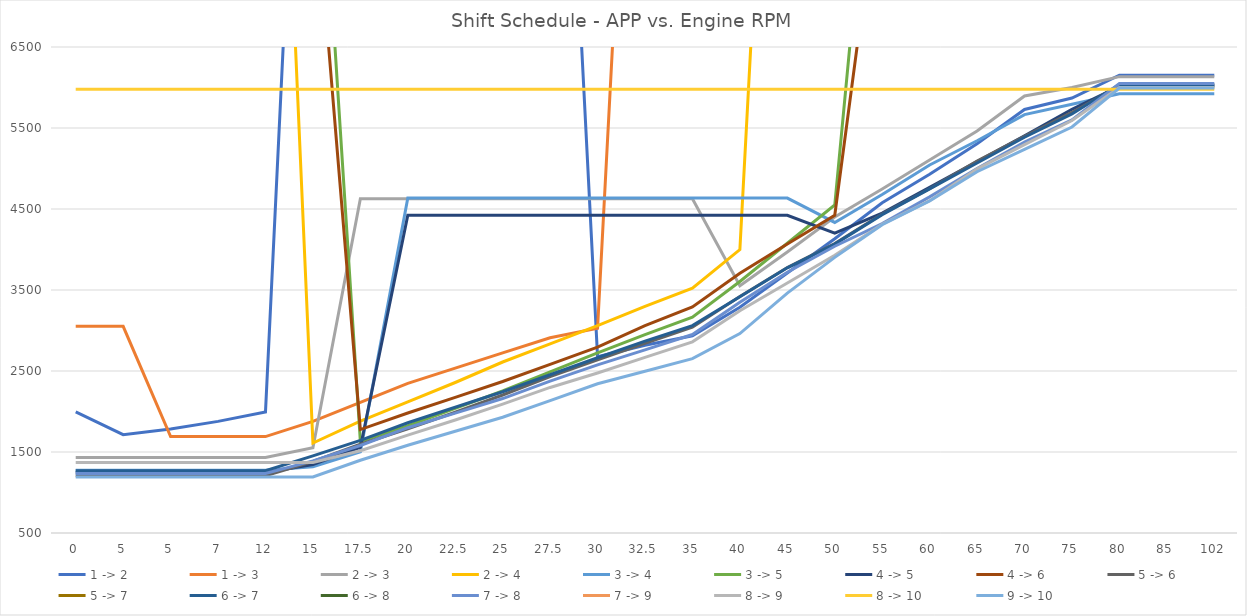
| Category | 1 -> 2 | 1 -> 3 | 2 -> 3 | 2 -> 4 | 3 -> 4 | 3 -> 5 | 4 -> 5 | 4 -> 6 | 5 -> 6 | 5 -> 7 | 6 -> 7 | 6 -> 8 | 7 -> 8 | 7 -> 9 | 8 -> 9 | 8 -> 10 | 9 -> 10 |
|---|---|---|---|---|---|---|---|---|---|---|---|---|---|---|---|---|---|
| 0.0 | 1995 | 3052 | 1432 | 14925 | 1276 | 10730 | 1247 | 8845 | 1208 | 10640 | 1268 | 8925 | 1235 | 7000 | 1370 | 5978 | 1191 |
| 5.0 | 1714 | 3052 | 1432 | 14925 | 1276 | 10730 | 1247 | 8845 | 1208 | 10640 | 1268 | 8925 | 1235 | 7000 | 1370 | 5978 | 1191 |
| 5.0 | 1784 | 1690 | 1432 | 14925 | 1276 | 10730 | 1247 | 8845 | 1208 | 10640 | 1268 | 8925 | 1235 | 7000 | 1370 | 5978 | 1191 |
| 7.0 | 1878 | 1690 | 1432 | 14925 | 1276 | 10730 | 1247 | 8845 | 1208 | 10640 | 1268 | 8925 | 1235 | 7000 | 1370 | 5978 | 1191 |
| 12.0 | 1995 | 1690 | 1432 | 14925 | 1276 | 10730 | 1247 | 8845 | 1208 | 10640 | 1268 | 8925 | 1235 | 7000 | 1370 | 5978 | 1191 |
| 15.0 | 14088 | 1878 | 1552 | 1611 | 1319 | 10730 | 1344 | 8845 | 1383 | 10640 | 1453 | 8925 | 1390 | 7000 | 1370 | 5978 | 1191 |
| 17.5 | 14088 | 2113 | 4626 | 1880 | 1502 | 1630 | 1556 | 1777 | 1596 | 10640 | 1644 | 8925 | 1580 | 7000 | 1515 | 5978 | 1398 |
| 20.0 | 14088 | 2348 | 4626 | 2119 | 4635 | 1824 | 4422 | 1981 | 1786 | 10640 | 1861 | 8925 | 1800 | 7000 | 1708 | 5978 | 1584 |
| 22.5 | 14088 | 2535 | 4626 | 2358 | 4635 | 2038 | 4422 | 2175 | 1991 | 10640 | 2052 | 8925 | 1980 | 7000 | 1895 | 5978 | 1756 |
| 25.0 | 14088 | 2723 | 4626 | 2611 | 4635 | 2253 | 4422 | 2370 | 2204 | 10640 | 2244 | 8925 | 2160 | 7000 | 2092 | 5978 | 1929 |
| 27.5 | 14088 | 2911 | 4626 | 2835 | 4635 | 2489 | 4422 | 2582 | 2432 | 10640 | 2454 | 8925 | 2375 | 7000 | 2297 | 5978 | 2135 |
| 30.0 | 2676 | 3028 | 4626 | 3059 | 4635 | 2725 | 4422 | 2795 | 2637 | 10640 | 2664 | 8925 | 2575 | 7000 | 2476 | 5978 | 2342 |
| 32.5 | 2817 | 14088 | 4626 | 3298 | 4635 | 2950 | 4422 | 3060 | 2842 | 10640 | 2868 | 8925 | 2760 | 7000 | 2668 | 5978 | 2497 |
| 35.0 | 2935 | 14088 | 4626 | 3522 | 4635 | 3165 | 4422 | 3290 | 3040 | 10640 | 3060 | 8925 | 2950 | 7000 | 2860 | 5978 | 2652 |
| 40.0 | 3287 | 14088 | 3552 | 3999 | 4635 | 3605 | 4422 | 3706 | 3420 | 10640 | 3417 | 8925 | 3350 | 7000 | 3245 | 5978 | 2962 |
| 45.0 | 3709 | 14088 | 3970 | 14925 | 4635 | 4077 | 4422 | 4068 | 3777 | 10640 | 3774 | 8925 | 3720 | 7000 | 3586 | 5978 | 3462 |
| 50.0 | 4132 | 14088 | 4402 | 14925 | 4334 | 4549 | 4201 | 4422 | 4073 | 10640 | 4067 | 8925 | 4040 | 7000 | 3928 | 5978 | 3903 |
| 55.0 | 4578 | 14088 | 4746 | 14925 | 4678 | 10730 | 4449 | 8845 | 4438 | 10640 | 4430 | 8925 | 4320 | 7000 | 4312 | 5978 | 4306 |
| 60.0 | 4930 | 14088 | 5104 | 14925 | 5043 | 10730 | 4767 | 8845 | 4750 | 10640 | 4749 | 8925 | 4650 | 7000 | 4603 | 5978 | 4599 |
| 65.0 | 5306 | 14088 | 5462 | 14925 | 5343 | 10730 | 5085 | 8845 | 5092 | 10640 | 5068 | 8925 | 5000 | 7000 | 4995 | 5978 | 4960 |
| 70.0 | 5729 | 14088 | 5895 | 14925 | 5665 | 10730 | 5404 | 8845 | 5396 | 10640 | 5386 | 8925 | 5325 | 7000 | 5294 | 5978 | 5236 |
| 75.0 | 5870 | 14088 | 5999 | 14925 | 5794 | 10730 | 5731 | 8845 | 5692 | 10640 | 5673 | 8925 | 5600 | 7000 | 5593 | 5978 | 5512 |
| 80.0 | 6151 | 14088 | 6134 | 14925 | 5922 | 10730 | 6014 | 8845 | 6026 | 10640 | 6037 | 8925 | 6050 | 7000 | 5999 | 5978 | 5994 |
| 85.0 | 6151 | 14088 | 6134 | 14925 | 5922 | 10730 | 6014 | 8845 | 6026 | 10640 | 6037 | 8925 | 6050 | 7000 | 5999 | 5978 | 5994 |
| 102.0 | 6151 | 14088 | 6134 | 14925 | 5922 | 10730 | 6014 | 8845 | 6026 | 10640 | 6037 | 8925 | 6050 | 7000 | 5999 | 5978 | 5994 |